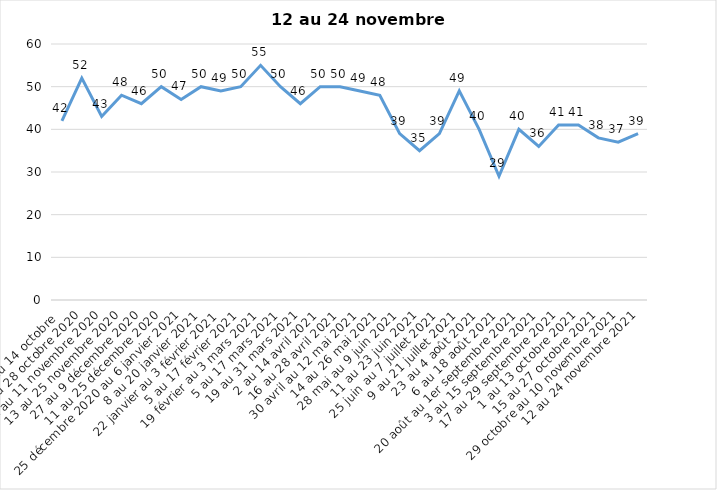
| Category | Toujours aux trois mesures |
|---|---|
| 2 au 14 octobre  | 42 |
| 16 au 28 octobre 2020 | 52 |
| 30 octobre au 11 novembre 2020 | 43 |
| 13 au 25 novembre 2020 | 48 |
| 27 au 9 décembre 2020 | 46 |
| 11 au 25 décembre 2020 | 50 |
| 25 décembre 2020 au 6 janvier 2021 | 47 |
| 8 au 20 janvier 2021 | 50 |
| 22 janvier au 3 février 2021 | 49 |
| 5 au 17 février 2021 | 50 |
| 19 février au 3 mars 2021 | 55 |
| 5 au 17 mars 2021 | 50 |
| 19 au 31 mars 2021 | 46 |
| 2 au 14 avril 2021 | 50 |
| 16 au 28 avril 2021 | 50 |
| 30 avril au 12 mai 2021 | 49 |
| 14 au 26 mai 2021 | 48 |
| 28 mai au 9 juin 2021 | 39 |
| 11 au 23 juin 2021 | 35 |
| 25 juin au 7 juillet 2021 | 39 |
| 9 au 21 juillet 2021 | 49 |
| 23 au 4 août 2021 | 40 |
| 6 au 18 août 2021 | 29 |
| 20 août au 1er septembre 2021 | 40 |
| 3 au 15 septembre 2021 | 36 |
| 17 au 29 septembre 2021 | 41 |
| 1 au 13 octobre 2021 | 41 |
| 15 au 27 octobre 2021 | 38 |
| 29 octobre au 10 novembre 2021 | 37 |
| 12 au 24 novembre 2021 | 39 |